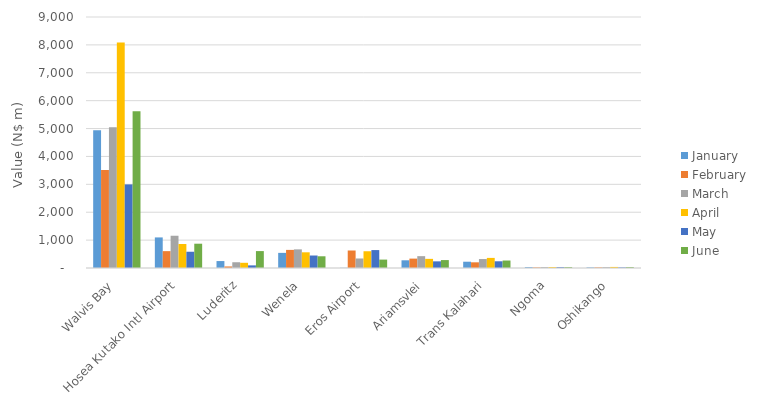
| Category | January | February | March | April | May | June |
|---|---|---|---|---|---|---|
| Walvis Bay | 4936.338 | 3514.405 | 5043.664 | 8082.689 | 2997.206 | 5617 |
| Hosea Kutako Intl Airport | 1096.618 | 604.646 | 1156.278 | 860.181 | 582.904 | 870.983 |
| Luderitz | 248.902 | 55.587 | 206.355 | 186.571 | 94 | 606.437 |
| Wenela | 542.289 | 649.178 | 668.242 | 562.641 | 447.816 | 420.165 |
| Eros Airport | 6.736 | 627.426 | 341.136 | 600.679 | 642.693 | 301.259 |
| Ariamsvlei | 276.35 | 336.7 | 424.601 | 327.722 | 238.364 | 284.101 |
| Trans Kalahari | 225.394 | 203.648 | 321.116 | 362.163 | 240.823 | 268.148 |
| Ngoma | 31.231 | 21.063 | 33.807 | 32.703 | 30.666 | 30.487 |
| Oshikango | 20.61 | 21.562 | 32.256 | 38.242 | 21.559 | 30.461 |